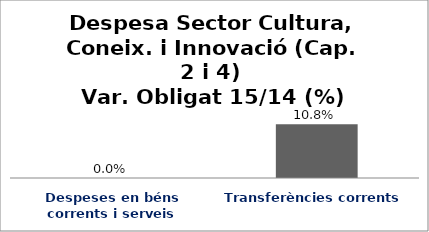
| Category | Series 0 |
|---|---|
| Despeses en béns corrents i serveis | 0 |
| Transferències corrents | 0.108 |